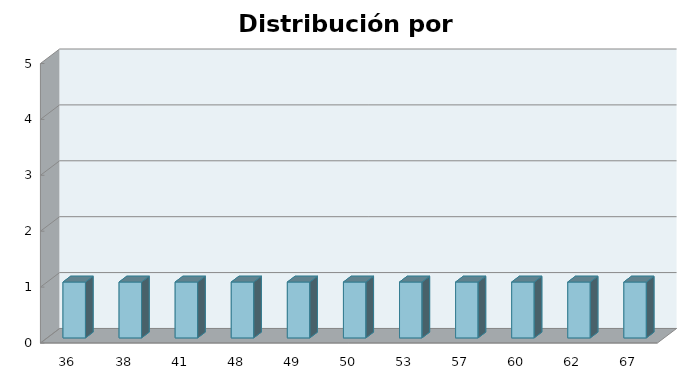
| Category | Series 1 |
|---|---|
| 36.0 | 1 |
| 38.0 | 1 |
| 41.0 | 1 |
| 48.0 | 1 |
| 49.0 | 1 |
| 50.0 | 1 |
| 53.0 | 1 |
| 57.0 | 1 |
| 60.0 | 1 |
| 62.0 | 1 |
| 67.0 | 1 |